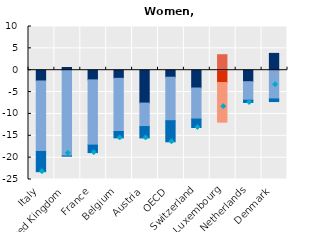
| Category | Hours per at work employees | 0 hours employment | Joblessness (net of population change) |
|---|---|---|---|
| Italy | -2.457 | -16.128 | -4.63 |
| United Kingdom | 0.625 | -19.616 | -0.033 |
| France | -2.211 | -14.922 | -1.717 |
| Belgium | -1.856 | -12.161 | -1.458 |
| Austria | -7.518 | -5.38 | -2.593 |
| OECD | -1.6 | -9.952 | -4.825 |
| Switzerland | -4.071 | -7.097 | -1.936 |
| Luxembourg | -2.815 | -9.07 | 3.545 |
| Netherlands | -2.628 | -4.234 | -0.517 |
| Denmark | 3.849 | -6.57 | -0.601 |